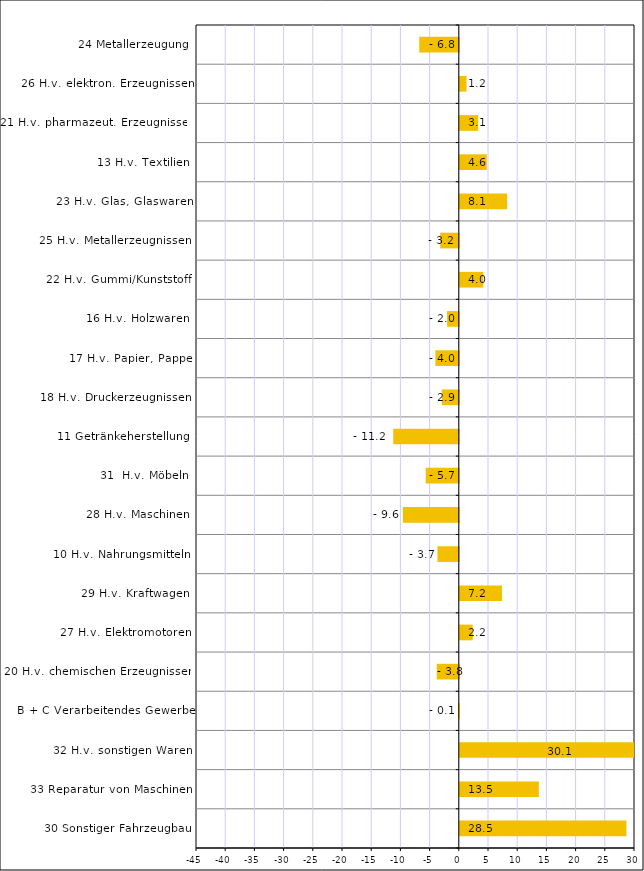
| Category | Series 0 |
|---|---|
| 30 Sonstiger Fahrzeugbau | 28.533 |
| 33 Reparatur von Maschinen | 13.535 |
| 32 H.v. sonstigen Waren | 30.139 |
| B + C Verarbeitendes Gewerbe | -0.121 |
| 20 H.v. chemischen Erzeugnissen | -3.778 |
| 27 H.v. Elektromotoren | 2.216 |
| 29 H.v. Kraftwagen | 7.222 |
| 10 H.v. Nahrungsmitteln | -3.658 |
| 28 H.v. Maschinen | -9.584 |
| 31  H.v. Möbeln | -5.669 |
| 11 Getränkeherstellung | -11.227 |
| 18 H.v. Druckerzeugnissen | -2.913 |
| 17 H.v. Papier, Pappe | -4.01 |
| 16 H.v. Holzwaren | -2.007 |
| 22 H.v. Gummi/Kunststoff | 4.023 |
| 25 H.v. Metallerzeugnissen | -3.179 |
| 23 H.v. Glas, Glaswaren | 8.101 |
| 13 H.v. Textilien | 4.616 |
| 21 H.v. pharmazeut. Erzeugnissen | 3.148 |
| 26 H.v. elektron. Erzeugnissen | 1.151 |
| 24 Metallerzeugung | -6.775 |